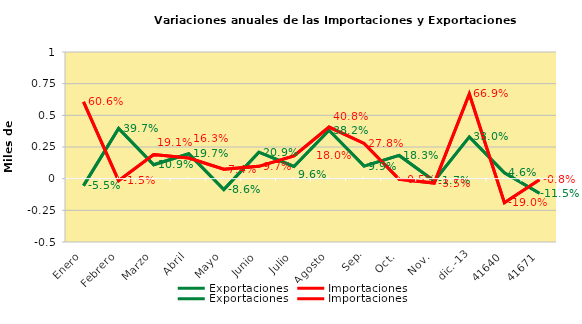
| Category | Exportaciones | Importaciones |
|---|---|---|
| Enero | -0.055 | 0.606 |
| Febrero | 0.397 | -0.015 |
| Marzo | 0.109 | 0.191 |
| Abril | 0.197 | 0.163 |
| Mayo | -0.086 | 0.074 |
| Junio | 0.209 | 0.097 |
| Julio | 0.096 | 0.18 |
| Agosto | 0.382 | 0.408 |
| Sep. | 0.099 | 0.278 |
| Oct. | 0.183 | -0.005 |
| Nov. | -0.017 | -0.035 |
| dic.-13 | 0.33 | 0.669 |
| 41640 | 0.046 | -0.19 |
| 41671 | -0.115 | -0.008 |